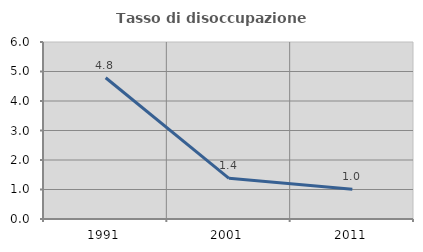
| Category | Tasso di disoccupazione giovanile  |
|---|---|
| 1991.0 | 4.787 |
| 2001.0 | 1.379 |
| 2011.0 | 1.01 |